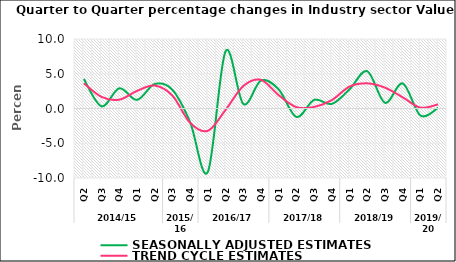
| Category | SEASONALLY ADJUSTED ESTIMATES | TREND CYCLE ESTIMATES |
|---|---|---|
| 0 | 4.243 | 3.617 |
| 1 | 0.312 | 1.669 |
| 2 | 2.906 | 1.267 |
| 3 | 1.242 | 2.53 |
| 4 | 3.522 | 3.301 |
| 5 | 2.68 | 1.85 |
| 6 | -1.976 | -2.061 |
| 7 | -9.107 | -3.212 |
| 8 | 8.238 | -0.202 |
| 9 | 0.662 | 3.228 |
| 10 | 4.023 | 4.119 |
| 11 | 2.746 | 1.909 |
| 12 | -1.213 | 0.19 |
| 13 | 1.238 | 0.223 |
| 14 | 0.665 | 1.211 |
| 15 | 2.757 | 3.156 |
| 16 | 5.365 | 3.619 |
| 17 | 0.813 | 2.998 |
| 18 | 3.601 | 1.61 |
| 19 | -1.01 | 0.118 |
| 20 | 0.101 | 0.597 |